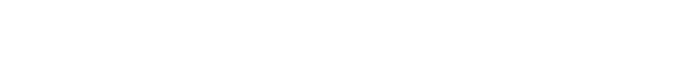
| Category | Total |
|---|---|
| 01/02/2010 | 150 |
| 02/02/2010 | 75 |
| 03/02/2010 | 200 |
| 04/02/2010 | 125 |
| 05/02/2010 | 100 |
| 06/02/2010 | 175 |
| 07/02/2010 | 100 |
| 08/02/2010 | 150 |
| 09/02/2010 | 75 |
| 10/02/2010 | 200 |
| 11/02/2010 | 125 |
| 12/02/2010 | 50 |
| 13/02/2010 | 25 |
| 14/02/2010 | 30 |